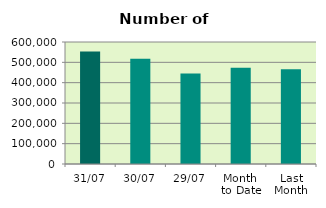
| Category | Series 0 |
|---|---|
| 31/07 | 552932 |
| 30/07 | 517962 |
| 29/07 | 444800 |
| Month 
to Date | 472929.565 |
| Last
Month | 466167.6 |